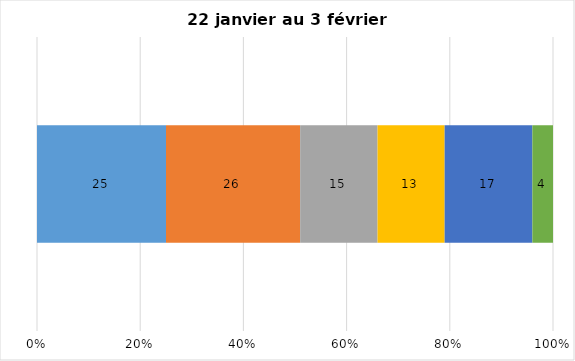
| Category | Plusieurs fois par jour | Une fois par jour | Quelques fois par semaine   | Une fois par semaine ou moins   |  Jamais   |  Je n’utilise pas les médias sociaux |
|---|---|---|---|---|---|---|
| 0 | 25 | 26 | 15 | 13 | 17 | 4 |